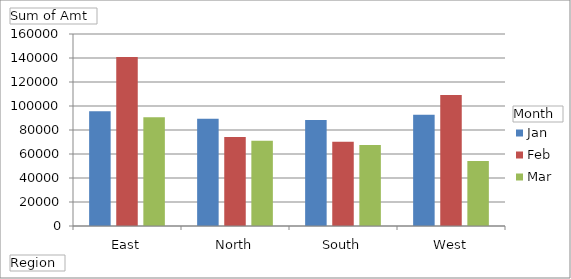
| Category | Jan | Feb | Mar |
|---|---|---|---|
| East | 95537 | 140828 | 90586 |
| North | 89407 | 74144 | 71025 |
| South | 88311 | 70143 | 67543 |
| West | 92691 | 109201 | 54098 |